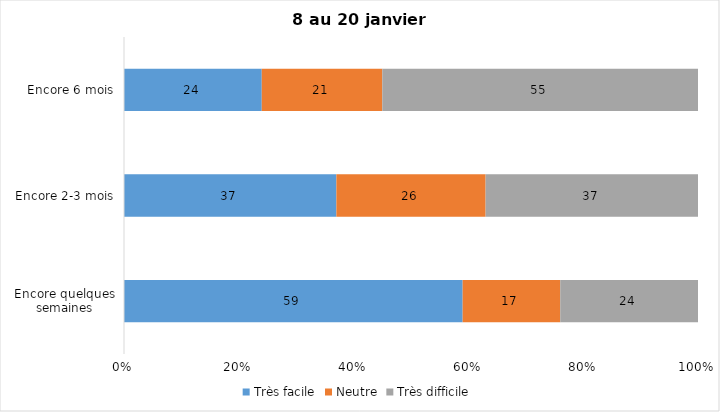
| Category | Très facile | Neutre | Très difficile |
|---|---|---|---|
| Encore quelques semaines | 59 | 17 | 24 |
| Encore 2-3 mois | 37 | 26 | 37 |
| Encore 6 mois | 24 | 21 | 55 |